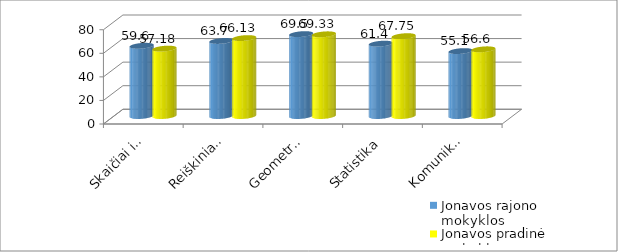
| Category | Jonavos rajono mokyklos | Jonavos pradinė mokykla |
|---|---|---|
| Skaičiai ir skaičiavimai | 59.6 | 57.18 |
| Reiškiniai, lygtys nelygybės | 63.7 | 66.13 |
| Geometrija, matai ir matavimai | 69.5 | 69.33 |
| Statistika | 61.4 | 67.75 |
| Komunikavimas ir bendrosios problemų sprendimo strategijos | 55.1 | 56.6 |